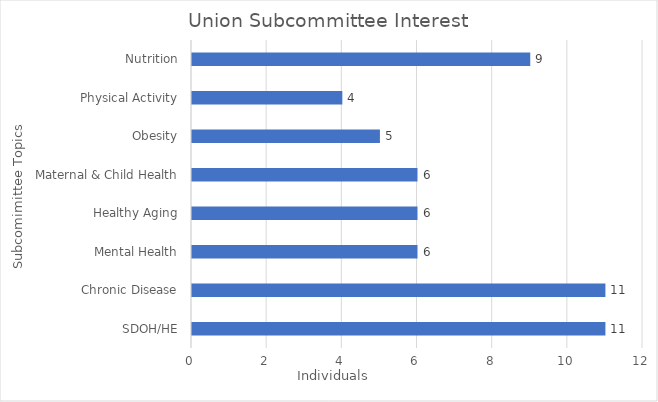
| Category | Series 0 |
|---|---|
| SDOH/HE | 11 |
| Chronic Disease | 11 |
| Mental Health | 6 |
| Healthy Aging | 6 |
| Maternal & Child Health | 6 |
| Obesity | 5 |
| Physical Activity | 4 |
| Nutrition | 9 |